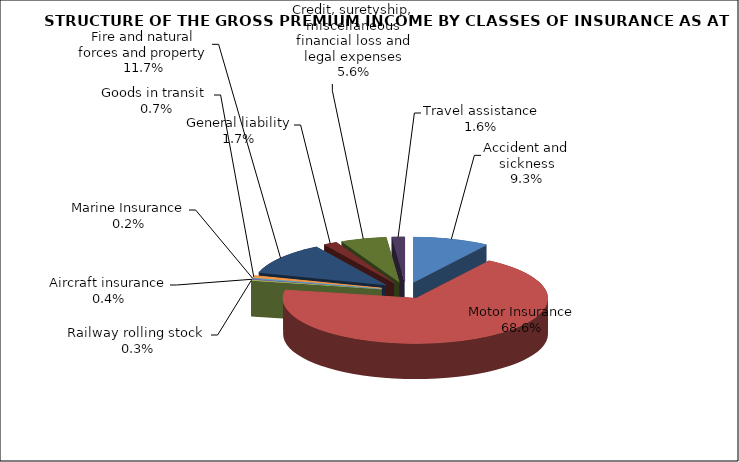
| Category | Accident and sickness |
|---|---|
| Accident and sickness | 0.093 |
| Motor Insurance | 0.686 |
| Railway rolling stock  | 0.003 |
| Aircraft insurance | 0.004 |
| Marine Insurance | 0.002 |
| Goods in transit  | 0.007 |
| Fire and natural forces and property | 0.117 |
| General liability | 0.017 |
| Credit, suretyship, miscellaneous financial loss and legal expenses | 0.056 |
| Travel assistance | 0.016 |